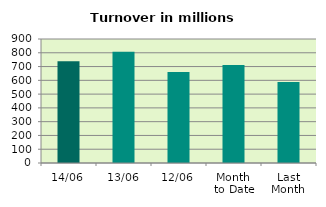
| Category | Series 0 |
|---|---|
| 14/06 | 739.176 |
| 13/06 | 806.831 |
| 12/06 | 660.798 |
| Month 
to Date | 711.377 |
| Last
Month | 587.249 |